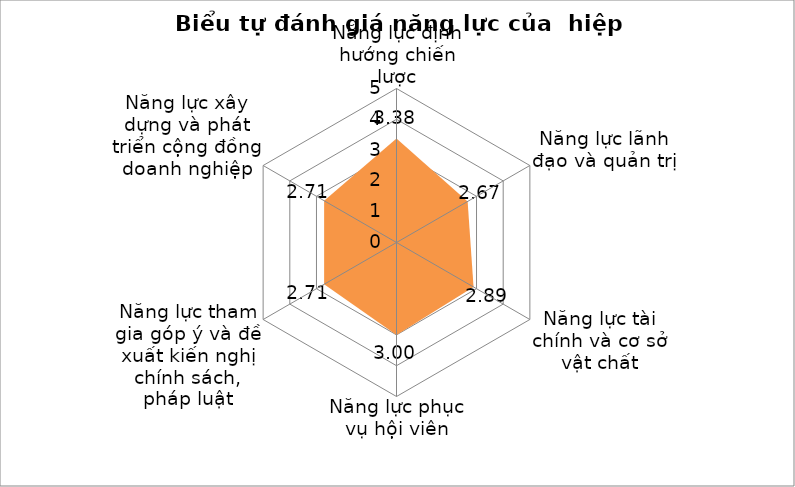
| Category | Series 0 |
|---|---|
| Năng lực định hướng chiến lược | 3.375 |
| Năng lực lãnh đạo và quản trị | 2.667 |
| Năng lực tài chính và cơ sở vật chất | 2.889 |
| Năng lực phục vụ hội viên | 3 |
| Năng lực tham gia góp ý và đề xuất kiến nghị chính sách, pháp luật | 2.714 |
| Năng lực xây dựng và phát triển cộng đồng doanh nghiệp | 2.714 |